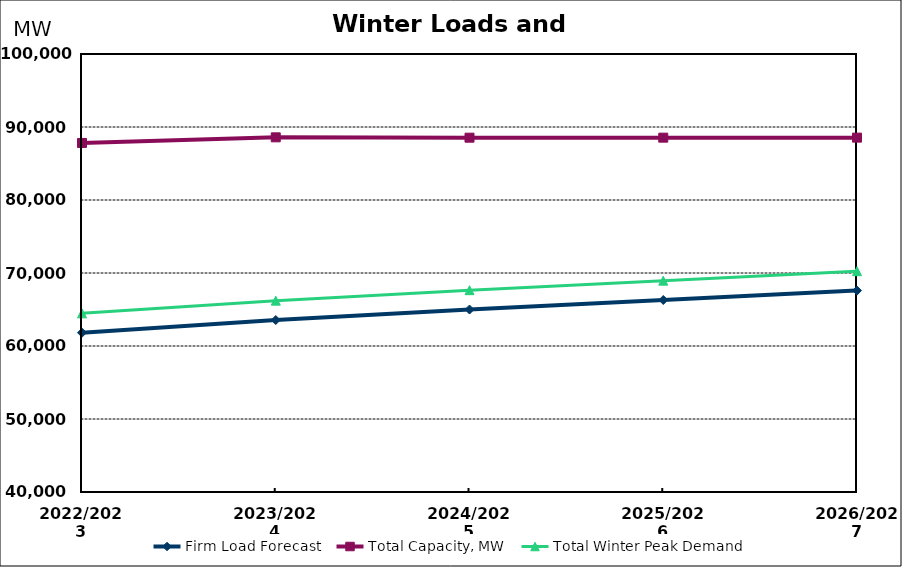
| Category | Firm Load Forecast | Total Capacity, MW | Total Winter Peak Demand |
|---|---|---|---|
| 2022/2023 | 61820.563 | 87812.619 | 64472.094 |
| 2023/2024 | 63560.132 | 88583.83 | 66211.662 |
| 2024/2025 | 64996.454 | 88536.83 | 67647.984 |
| 2025/2026 | 66300.897 | 88539.83 | 68952.427 |
| 2026/2027 | 67592.849 | 88542.83 | 70244.38 |